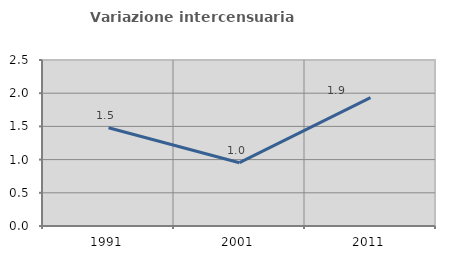
| Category | Variazione intercensuaria annua |
|---|---|
| 1991.0 | 1.479 |
| 2001.0 | 0.953 |
| 2011.0 | 1.933 |